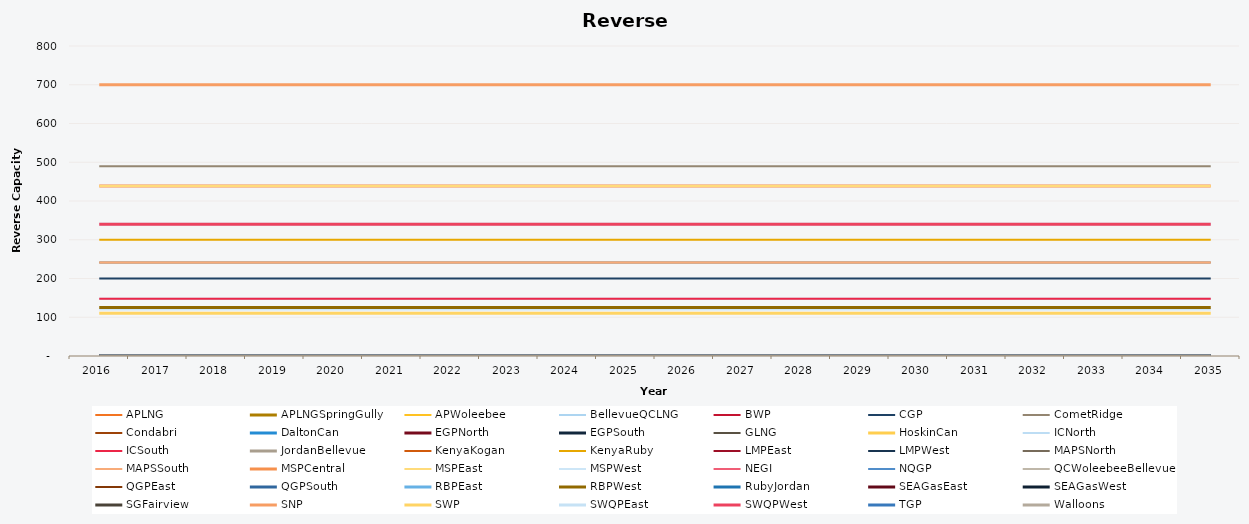
| Category | APLNG | APLNGSpringGully | APWoleebee | BellevueQCLNG | BWP | CGP | CometRidge | Condabri | DaltonCan | EGPNorth | EGPSouth | GLNG | HoskinCan | ICNorth | ICSouth | JordanBellevue | KenyaKogan | KenyaRuby | LMPEast | LMPWest | MAPSNorth | MAPSSouth | MSPCentral | MSPEast | MSPWest | NEGI | NQGP | QCWoleebeeBellevue | QGPEast | QGPSouth | RBPEast | RBPWest | RubyJordan | SEAGasEast | SEAGasWest | SGFairview | SNP | SWP | SWQPEast | SWQPWest | TGP | Walloons |
|---|---|---|---|---|---|---|---|---|---|---|---|---|---|---|---|---|---|---|---|---|---|---|---|---|---|---|---|---|---|---|---|---|---|---|---|---|---|---|---|---|---|---|
| 2016.0 | 0 | 0 | 0 | 0 | 0 | 200 | 490 | 0 | 0 | 0 | 0 | 0 | 0 | 148 | 148 | 0 | 0 | 300 | 0 | 0 | 241 | 241 | 439 | 439 | 120 | 0 | 0 | 0 | 0 | 0 | 0 | 125 | 0 | 0 | 0 | 0 | 700 | 110.5 | 340 | 340 | 0 | 0 |
| 2017.0 | 0 | 0 | 0 | 0 | 0 | 200 | 490 | 0 | 0 | 0 | 0 | 0 | 0 | 148 | 148 | 0 | 0 | 300 | 0 | 0 | 241 | 241 | 439 | 439 | 120 | 0 | 0 | 0 | 0 | 0 | 0 | 125 | 0 | 0 | 0 | 0 | 700 | 110.5 | 340 | 340 | 0 | 0 |
| 2018.0 | 0 | 0 | 0 | 0 | 0 | 200 | 490 | 0 | 0 | 0 | 0 | 0 | 0 | 148 | 148 | 0 | 0 | 300 | 0 | 0 | 241 | 241 | 439 | 439 | 120 | 0 | 0 | 0 | 0 | 0 | 0 | 125 | 0 | 0 | 0 | 0 | 700 | 110.5 | 340 | 340 | 0 | 0 |
| 2019.0 | 0 | 0 | 0 | 0 | 0 | 200 | 490 | 0 | 0 | 0 | 0 | 0 | 0 | 148 | 148 | 0 | 0 | 300 | 0 | 0 | 241 | 241 | 439 | 439 | 120 | 0 | 0 | 0 | 0 | 0 | 0 | 125 | 0 | 0 | 0 | 0 | 700 | 110.5 | 340 | 340 | 0 | 0 |
| 2020.0 | 0 | 0 | 0 | 0 | 0 | 200 | 490 | 0 | 0 | 0 | 0 | 0 | 0 | 148 | 148 | 0 | 0 | 300 | 0 | 0 | 241 | 241 | 439 | 439 | 120 | 0 | 0 | 0 | 0 | 0 | 0 | 125 | 0 | 0 | 0 | 0 | 700 | 110.5 | 340 | 340 | 0 | 0 |
| 2021.0 | 0 | 0 | 0 | 0 | 0 | 200 | 490 | 0 | 0 | 0 | 0 | 0 | 0 | 148 | 148 | 0 | 0 | 300 | 0 | 0 | 241 | 241 | 439 | 439 | 120 | 0 | 0 | 0 | 0 | 0 | 0 | 125 | 0 | 0 | 0 | 0 | 700 | 110.5 | 340 | 340 | 0 | 0 |
| 2022.0 | 0 | 0 | 0 | 0 | 0 | 200 | 490 | 0 | 0 | 0 | 0 | 0 | 0 | 148 | 148 | 0 | 0 | 300 | 0 | 0 | 241 | 241 | 439 | 439 | 120 | 0 | 0 | 0 | 0 | 0 | 0 | 125 | 0 | 0 | 0 | 0 | 700 | 110.5 | 340 | 340 | 0 | 0 |
| 2023.0 | 0 | 0 | 0 | 0 | 0 | 200 | 490 | 0 | 0 | 0 | 0 | 0 | 0 | 148 | 148 | 0 | 0 | 300 | 0 | 0 | 241 | 241 | 439 | 439 | 120 | 0 | 0 | 0 | 0 | 0 | 0 | 125 | 0 | 0 | 0 | 0 | 700 | 110.5 | 340 | 340 | 0 | 0 |
| 2024.0 | 0 | 0 | 0 | 0 | 0 | 200 | 490 | 0 | 0 | 0 | 0 | 0 | 0 | 148 | 148 | 0 | 0 | 300 | 0 | 0 | 241 | 241 | 439 | 439 | 120 | 0 | 0 | 0 | 0 | 0 | 0 | 125 | 0 | 0 | 0 | 0 | 700 | 110.5 | 340 | 340 | 0 | 0 |
| 2025.0 | 0 | 0 | 0 | 0 | 0 | 200 | 490 | 0 | 0 | 0 | 0 | 0 | 0 | 148 | 148 | 0 | 0 | 300 | 0 | 0 | 241 | 241 | 439 | 439 | 120 | 0 | 0 | 0 | 0 | 0 | 0 | 125 | 0 | 0 | 0 | 0 | 700 | 110.5 | 340 | 340 | 0 | 0 |
| 2026.0 | 0 | 0 | 0 | 0 | 0 | 200 | 490 | 0 | 0 | 0 | 0 | 0 | 0 | 148 | 148 | 0 | 0 | 300 | 0 | 0 | 241 | 241 | 439 | 439 | 120 | 0 | 0 | 0 | 0 | 0 | 0 | 125 | 0 | 0 | 0 | 0 | 700 | 110.5 | 340 | 340 | 0 | 0 |
| 2027.0 | 0 | 0 | 0 | 0 | 0 | 200 | 490 | 0 | 0 | 0 | 0 | 0 | 0 | 148 | 148 | 0 | 0 | 300 | 0 | 0 | 241 | 241 | 439 | 439 | 120 | 0 | 0 | 0 | 0 | 0 | 0 | 125 | 0 | 0 | 0 | 0 | 700 | 110.5 | 340 | 340 | 0 | 0 |
| 2028.0 | 0 | 0 | 0 | 0 | 0 | 200 | 490 | 0 | 0 | 0 | 0 | 0 | 0 | 148 | 148 | 0 | 0 | 300 | 0 | 0 | 241 | 241 | 439 | 439 | 120 | 0 | 0 | 0 | 0 | 0 | 0 | 125 | 0 | 0 | 0 | 0 | 700 | 110.5 | 340 | 340 | 0 | 0 |
| 2029.0 | 0 | 0 | 0 | 0 | 0 | 200 | 490 | 0 | 0 | 0 | 0 | 0 | 0 | 148 | 148 | 0 | 0 | 300 | 0 | 0 | 241 | 241 | 439 | 439 | 120 | 0 | 0 | 0 | 0 | 0 | 0 | 125 | 0 | 0 | 0 | 0 | 700 | 110.5 | 340 | 340 | 0 | 0 |
| 2030.0 | 0 | 0 | 0 | 0 | 0 | 200 | 490 | 0 | 0 | 0 | 0 | 0 | 0 | 148 | 148 | 0 | 0 | 300 | 0 | 0 | 241 | 241 | 439 | 439 | 120 | 0 | 0 | 0 | 0 | 0 | 0 | 125 | 0 | 0 | 0 | 0 | 700 | 110.5 | 340 | 340 | 0 | 0 |
| 2031.0 | 0 | 0 | 0 | 0 | 0 | 200 | 490 | 0 | 0 | 0 | 0 | 0 | 0 | 148 | 148 | 0 | 0 | 300 | 0 | 0 | 241 | 241 | 439 | 439 | 120 | 0 | 0 | 0 | 0 | 0 | 0 | 125 | 0 | 0 | 0 | 0 | 700 | 110.5 | 340 | 340 | 0 | 0 |
| 2032.0 | 0 | 0 | 0 | 0 | 0 | 200 | 490 | 0 | 0 | 0 | 0 | 0 | 0 | 148 | 148 | 0 | 0 | 300 | 0 | 0 | 241 | 241 | 439 | 439 | 120 | 0 | 0 | 0 | 0 | 0 | 0 | 125 | 0 | 0 | 0 | 0 | 700 | 110.5 | 340 | 340 | 0 | 0 |
| 2033.0 | 0 | 0 | 0 | 0 | 0 | 200 | 490 | 0 | 0 | 0 | 0 | 0 | 0 | 148 | 148 | 0 | 0 | 300 | 0 | 0 | 241 | 241 | 439 | 439 | 120 | 0 | 0 | 0 | 0 | 0 | 0 | 125 | 0 | 0 | 0 | 0 | 700 | 110.5 | 340 | 340 | 0 | 0 |
| 2034.0 | 0 | 0 | 0 | 0 | 0 | 200 | 490 | 0 | 0 | 0 | 0 | 0 | 0 | 148 | 148 | 0 | 0 | 300 | 0 | 0 | 241 | 241 | 439 | 439 | 120 | 0 | 0 | 0 | 0 | 0 | 0 | 125 | 0 | 0 | 0 | 0 | 700 | 110.5 | 340 | 340 | 0 | 0 |
| 2035.0 | 0 | 0 | 0 | 0 | 0 | 200 | 490 | 0 | 0 | 0 | 0 | 0 | 0 | 148 | 148 | 0 | 0 | 300 | 0 | 0 | 241 | 241 | 439 | 439 | 120 | 0 | 0 | 0 | 0 | 0 | 0 | 125 | 0 | 0 | 0 | 0 | 700 | 110.5 | 340 | 340 | 0 | 0 |